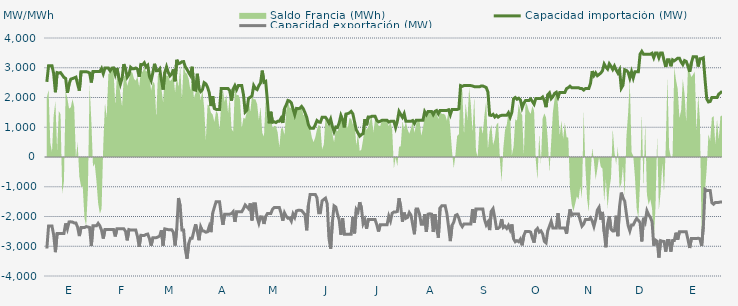
| Category | Capacidad importación (MW) | Capacidad exportación (MW) |
|---|---|---|
| 0 | 2525 | -3075 |
| 1900-01-01 | 3066.667 | -2320.833 |
| 1900-01-02 | 3066.667 | -2320.833 |
| 1900-01-03 | 3066.667 | -2320.833 |
| 1900-01-04 | 2800 | -2622.917 |
| 1900-01-05 | 2177.083 | -3197.917 |
| 1900-01-06 | 2837.5 | -2568.75 |
| 1900-01-07 | 2820.833 | -2568.75 |
| 1900-01-08 | 2837.5 | -2568.75 |
| 1900-01-09 | 2758.333 | -2568.75 |
| 1900-01-10 | 2675 | -2568.75 |
| 1900-01-11 | 2641.667 | -2233.333 |
| 1900-01-12 | 2156.25 | -2418.75 |
| 1900-01-13 | 2450 | -2181.25 |
| 1900-01-14 | 2616.667 | -2179.167 |
| 1900-01-15 | 2637.5 | -2187.5 |
| 1900-01-16 | 2658.333 | -2216.667 |
| 1900-01-17 | 2683.333 | -2216.667 |
| 1900-01-18 | 2450 | -2362.5 |
| 1900-01-19 | 2231.25 | -2658.333 |
| 1900-01-20 | 2866.667 | -2372.917 |
| 1900-01-21 | 2866.667 | -2372.917 |
| 1900-01-22 | 2866.667 | -2372.917 |
| 1900-01-23 | 2866.667 | -2339.583 |
| 1900-01-24 | 2854.167 | -2352.083 |
| 1900-01-25 | 2825 | -2368.75 |
| 1900-01-26 | 2504.167 | -2991.667 |
| 1900-01-27 | 2875 | -2314.583 |
| 1900-01-28 | 2875 | -2314.583 |
| 1900-01-29 | 2875 | -2314.583 |
| 1900-01-30 | 2875 | -2231.25 |
| 1900-01-31 | 2875 | -2314.583 |
| 1900-02-01 | 2975 | -2462.5 |
| 1900-02-02 | 2802.083 | -2741.667 |
| 1900-02-03 | 2987.5 | -2433.333 |
| 1900-02-04 | 2987.5 | -2433.333 |
| 1900-02-05 | 2987.5 | -2433.333 |
| 1900-02-06 | 2893.75 | -2433.333 |
| 1900-02-07 | 2987.5 | -2433.333 |
| 1900-02-08 | 2995.833 | -2437.5 |
| 1900-02-09 | 2781.25 | -2670.833 |
| 1900-02-10 | 2993.75 | -2412.5 |
| 1900-02-11 | 2679.167 | -2412.5 |
| 1900-02-12 | 2450 | -2412.5 |
| 1900-02-13 | 2645.833 | -2412.5 |
| 1900-02-14 | 3120.833 | -2412.5 |
| 1900-02-15 | 2958.333 | -2495.833 |
| 1900-02-16 | 2681.25 | -2802.083 |
| 1900-02-17 | 2768.75 | -2439.583 |
| 1900-02-18 | 3016.667 | -2456.25 |
| 1900-02-19 | 2966.667 | -2454.167 |
| 1900-02-20 | 2966.667 | -2452.083 |
| 1900-02-21 | 2991.667 | -2454.167 |
| 1900-02-22 | 2952.083 | -2670.833 |
| 1900-02-23 | 2697.917 | -3016.667 |
| 1900-02-24 | 3108.333 | -2631.25 |
| 1900-02-25 | 3100 | -2637.5 |
| 1900-02-26 | 3166.667 | -2637.5 |
| 1900-02-27 | 3025 | -2604.167 |
| 1900-02-28 | 3083.333 | -2589.583 |
| 1900-02-28 | 2708.333 | -2743.75 |
| 1900-03-01 | 2570.833 | -2979.167 |
| 1900-03-02 | 2833.333 | -2716.667 |
| 1900-03-03 | 3133.333 | -2716.667 |
| 1900-03-04 | 2900 | -2710.417 |
| 1900-03-05 | 2904.167 | -2689.583 |
| 1900-03-06 | 2966.667 | -2654.167 |
| 1900-03-07 | 2587.5 | -2462.5 |
| 1900-03-08 | 2266.667 | -2977.083 |
| 1900-03-09 | 2845.833 | -2416.667 |
| 1900-03-10 | 3033.333 | -2429.167 |
| 1900-03-11 | 2845.833 | -2441.667 |
| 1900-03-12 | 2725 | -2441.667 |
| 1900-03-13 | 2783.333 | -2441.667 |
| 1900-03-14 | 2943.75 | -2529.167 |
| 1900-03-15 | 2545.833 | -2975 |
| 1900-03-16 | 3266.667 | -2410.417 |
| 1900-03-17 | 3137.5 | -1379.167 |
| 1900-03-18 | 3158.333 | -1654.167 |
| 1900-03-19 | 3200 | -2454.167 |
| 1900-03-20 | 3208.333 | -2456.25 |
| 1900-03-21 | 3025 | -3112.5 |
| 1900-03-22 | 2943.75 | -3418.75 |
| 1900-03-23 | 2835.417 | -2900 |
| 1900-03-24 | 2741.667 | -2729.167 |
| 1900-03-25 | 3033.333 | -2729.167 |
| 1900-03-26 | 2262.5 | -2487.5 |
| 1900-03-27 | 2245.833 | -2262.5 |
| 1900-03-28 | 2797.917 | -2500 |
| 1900-03-29 | 2295.652 | -2797.826 |
| 1900-03-30 | 2200 | -2350 |
| 1900-03-31 | 2262.5 | -2481.25 |
| 1900-04-01 | 2500 | -2491.667 |
| 1900-04-02 | 2458.333 | -2529.167 |
| 1900-04-03 | 2341.667 | -2512.5 |
| 1900-04-04 | 2162.5 | -2331.25 |
| 1900-04-05 | 1712.5 | -2525 |
| 1900-04-06 | 2043.75 | -1885.417 |
| 1900-04-07 | 1629.167 | -1687.5 |
| 1900-04-08 | 1600 | -1500 |
| 1900-04-09 | 1600 | -1500 |
| 1900-04-10 | 1600 | -1500 |
| 1900-04-11 | 2300 | -1937.5 |
| 1900-04-12 | 2300 | -2281.25 |
| 1900-04-13 | 2300 | -1920.833 |
| 1900-04-14 | 2300 | -1920.833 |
| 1900-04-15 | 2300 | -1920.833 |
| 1900-04-16 | 2225 | -1920.833 |
| 1900-04-17 | 1896.083 | -1898.167 |
| 1900-04-18 | 2287.5 | -1837.5 |
| 1900-04-19 | 2400 | -2181.25 |
| 1900-04-20 | 2266.667 | -1837.5 |
| 1900-04-21 | 2400 | -1841.667 |
| 1900-04-22 | 2400 | -1841.667 |
| 1900-04-23 | 2400 | -1841.667 |
| 1900-04-24 | 2100 | -1737.5 |
| 1900-04-25 | 1512.5 | -1612.5 |
| 1900-04-26 | 1575 | -1675 |
| 1900-04-27 | 1975 | -1737.5 |
| 1900-04-28 | 2008.333 | -1560.417 |
| 1900-04-29 | 2056.25 | -2133.333 |
| 1900-04-30 | 2400 | -1570.833 |
| 1900-05-01 | 2300 | -1570.833 |
| 1900-05-02 | 2266.667 | -2031.25 |
| 1900-05-03 | 2400 | -2225 |
| 1900-05-04 | 2487.5 | -2010.417 |
| 1900-05-05 | 2904.167 | -2016.667 |
| 1900-05-06 | 2512.5 | -2250 |
| 1900-05-07 | 2541.667 | -2000 |
| 1900-05-08 | 1884.392 | -1900 |
| 1900-05-09 | 1133.333 | -1900 |
| 1900-05-10 | 1520.875 | -1900 |
| 1900-05-11 | 1166.667 | -1758.333 |
| 1900-05-12 | 1183.333 | -1700 |
| 1900-05-13 | 1158.333 | -1700 |
| 1900-05-14 | 1200 | -1700 |
| 1900-05-15 | 1200 | -1700 |
| 1900-05-16 | 1304.583 | -1887.5 |
| 1900-05-17 | 1145.417 | -2139.583 |
| 1900-05-18 | 1629.167 | -1875 |
| 1900-05-19 | 1750 | -1987.5 |
| 1900-05-20 | 1900 | -2058.333 |
| 1900-05-21 | 1879.167 | -2050 |
| 1900-05-22 | 1820.833 | -2156.25 |
| 1900-05-23 | 1616.667 | -1912.5 |
| 1900-05-24 | 1420.833 | -2027.083 |
| 1900-05-25 | 1633.333 | -1812.5 |
| 1900-05-26 | 1625 | -1791.667 |
| 1900-05-27 | 1637.5 | -1791.667 |
| 1900-05-28 | 1700 | -1800 |
| 1900-05-29 | 1620.833 | -1868.75 |
| 1900-05-30 | 1487.5 | -1937.5 |
| 1900-05-31 | 1337.5 | -2464.583 |
| 1900-06-01 | 1083.333 | -1610.417 |
| 1900-06-02 | 966.667 | -1258.333 |
| 1900-06-03 | 966.667 | -1258.333 |
| 1900-06-04 | 966.667 | -1258.333 |
| 1900-06-05 | 1083.333 | -1258.333 |
| 1900-06-06 | 1225 | -1375 |
| 1900-06-07 | 1175 | -1875 |
| 1900-06-08 | 1166.667 | -1875 |
| 1900-06-09 | 1333.333 | -1475 |
| 1900-06-10 | 1333.333 | -1425 |
| 1900-06-11 | 1333.333 | -1383.333 |
| 1900-06-12 | 1254.167 | -1577.083 |
| 1900-06-13 | 1133.333 | -2725 |
| 1900-06-14 | 1275 | -3081.25 |
| 1900-06-15 | 1029.167 | -2189.583 |
| 1900-06-16 | 850 | -1641.667 |
| 1900-06-17 | 1008.333 | -1683.333 |
| 1900-06-18 | 991.667 | -1916.667 |
| 1900-06-19 | 1150 | -2114.583 |
| 1900-06-20 | 1400 | -2612.5 |
| 1900-06-21 | 1262.5 | -2058.333 |
| 1900-06-22 | 995.833 | -2600 |
| 1900-06-23 | 1445.833 | -2600 |
| 1900-06-24 | 1458.333 | -2600 |
| 1900-06-25 | 1483.333 | -2600 |
| 1900-06-26 | 1533.333 | -2600 |
| 1900-06-27 | 1450 | -2012.5 |
| 1900-06-28 | 1175 | -2566.667 |
| 1900-06-29 | 912.5 | -1762.5 |
| 1900-06-30 | 806.25 | -1841.667 |
| 1900-07-01 | 700 | -1520.833 |
| 1900-07-02 | 756.25 | -1710.417 |
| 1900-07-03 | 783.333 | -2239.583 |
| 1900-07-04 | 1270.833 | -2112.5 |
| 1900-07-05 | 1066.667 | -2410.417 |
| 1900-07-06 | 1345.833 | -2104.167 |
| 1900-07-07 | 1341.667 | -2104.167 |
| 1900-07-08 | 1366.667 | -2104.167 |
| 1900-07-09 | 1366.667 | -2104.167 |
| 1900-07-10 | 1366.667 | -2104.167 |
| 1900-07-11 | 1231.25 | -2275 |
| 1900-07-12 | 1181.25 | -2504.167 |
| 1900-07-13 | 1200 | -2275 |
| 1900-07-14 | 1233.333 | -2275 |
| 1900-07-15 | 1233.333 | -2275 |
| 1900-07-16 | 1233.333 | -2275 |
| 1900-07-17 | 1233.333 | -2275 |
| 1900-07-18 | 1175 | -1987.5 |
| 1900-07-19 | 1200 | -2147.917 |
| 1900-07-20 | 1200 | -1887.5 |
| 1900-07-21 | 1200 | -1850 |
| 1900-07-22 | 987.5 | -1850 |
| 1900-07-23 | 1200 | -1831.25 |
| 1900-07-24 | 1529.167 | -1387.5 |
| 1900-07-25 | 1427.083 | -1679.167 |
| 1900-07-26 | 1331.25 | -2172.917 |
| 1900-07-27 | 1456.25 | -1868.75 |
| 1900-07-28 | 1200 | -2060.417 |
| 1900-07-29 | 1200 | -2029.167 |
| 1900-07-30 | 1200 | -1868.75 |
| 1900-07-31 | 1200 | -1958.333 |
| 1900-08-01 | 1225 | -2275 |
| 1900-08-02 | 1125 | -2595.833 |
| 1900-08-03 | 1233.333 | -1750 |
| 1900-08-04 | 1233.333 | -1750 |
| 1900-08-05 | 1233.333 | -1925 |
| 1900-08-06 | 1233.333 | -2262.5 |
| 1900-08-07 | 1233.333 | -2262.5 |
| 1900-08-08 | 1525 | -1925 |
| 1900-08-09 | 1425 | -2520.833 |
| 1900-08-10 | 1533.333 | -1920.833 |
| 1900-08-11 | 1533.333 | -1908.333 |
| 1900-08-12 | 1533.333 | -1920.833 |
| 1900-08-13 | 1425 | -2520.833 |
| 1900-08-14 | 1533.333 | -1920.833 |
| 1900-08-15 | 1562.5 | -2412.5 |
| 1900-08-16 | 1454.167 | -2710.417 |
| 1900-08-17 | 1566.667 | -1712.5 |
| 1900-08-18 | 1566.667 | -1641.667 |
| 1900-08-19 | 1566.667 | -1641.667 |
| 1900-08-20 | 1566.667 | -1641.667 |
| 1900-08-21 | 1566.667 | -1904.167 |
| 1900-08-22 | 1587.5 | -2362.5 |
| 1900-08-23 | 1418.75 | -2827.083 |
| 1900-08-24 | 1595.833 | -2297.917 |
| 1900-08-25 | 1595.833 | -2193.75 |
| 1900-08-26 | 1595.833 | -1964.583 |
| 1900-08-27 | 1595.833 | -1937.5 |
| 1900-08-28 | 1618.75 | -2058.333 |
| 1900-08-29 | 2400 | -2250 |
| 1900-08-30 | 2375 | -2341.667 |
| 1900-08-31 | 2400 | -2250 |
| 1900-09-01 | 2400 | -2250 |
| 1900-09-02 | 2400 | -2250 |
| 1900-09-03 | 2400 | -2250 |
| 1900-09-04 | 2400 | -2250 |
| 1900-09-05 | 2387.5 | -1750 |
| 1900-09-06 | 2364.583 | -2208.333 |
| 1900-09-07 | 2364.583 | -1745.833 |
| 1900-09-08 | 2360.417 | -1745.833 |
| 1900-09-09 | 2358.333 | -1745.833 |
| 1900-09-10 | 2387.5 | -1745.833 |
| 1900-09-11 | 2387.5 | -1745.833 |
| 1900-09-12 | 2362.5 | -2100 |
| 1900-09-13 | 2335.417 | -2283.333 |
| 1900-09-14 | 2181.25 | -2187.5 |
| 1900-09-15 | 1408.333 | -2456.25 |
| 1900-09-16 | 1395.833 | -1820.833 |
| 1900-09-17 | 1433.333 | -1737.5 |
| 1900-09-18 | 1345.833 | -2037.5 |
| 1900-09-19 | 1400 | -2400 |
| 1900-09-20 | 1341.667 | -2400 |
| 1900-09-21 | 1383.333 | -2345.833 |
| 1900-09-22 | 1400 | -2087.5 |
| 1900-09-23 | 1400 | -2370.833 |
| 1900-09-24 | 1400 | -2327.083 |
| 1900-09-25 | 1400 | -2400 |
| 1900-09-26 | 1487.5 | -2300 |
| 1900-09-27 | 1337.5 | -2445.833 |
| 1900-09-28 | 1500 | -2266.667 |
| 1900-09-29 | 1958.333 | -2750 |
| 1900-09-30 | 2000 | -2850 |
| 1900-10-01 | 1941.667 | -2812.5 |
| 1900-10-02 | 1975 | -2850 |
| 1900-10-03 | 1920.833 | -2762.5 |
| 1900-10-04 | 1654.167 | -2968.75 |
| 1900-10-05 | 1808.333 | -2639.583 |
| 1900-10-06 | 1900 | -2500 |
| 1900-10-07 | 1900 | -2500 |
| 1900-10-08 | 1900 | -2500 |
| 1900-10-09 | 1950 | -2525 |
| 1900-10-10 | 1866.667 | -2727.083 |
| 1900-10-11 | 1775 | -2877.083 |
| 1900-10-12 | 1966.667 | -2462.5 |
| 1900-10-13 | 1966.667 | -2400 |
| 1900-10-14 | 1966.667 | -2525 |
| 1900-10-15 | 1966.667 | -2483.333 |
| 1900-10-16 | 2016.667 | -2583.333 |
| 1900-10-17 | 1900 | -2837.5 |
| 1900-10-18 | 1675 | -2887.5 |
| 1900-10-19 | 2091.667 | -2477.083 |
| 1900-10-20 | 2154.167 | -2325 |
| 1900-10-21 | 1962.5 | -2162.5 |
| 1900-10-22 | 2029.167 | -2387.5 |
| 1900-10-23 | 2137.5 | -2387.5 |
| 1900-10-24 | 2175 | -2387.5 |
| 1900-10-25 | 2010 | -1886 |
| 1900-10-26 | 2170.833 | -2383.333 |
| 1900-10-27 | 2170.833 | -2383.333 |
| 1900-10-28 | 2170.833 | -2383.333 |
| 1900-10-29 | 2170.833 | -2383.333 |
| 1900-10-30 | 2300 | -2579.167 |
| 1900-10-31 | 2331.25 | -2131.25 |
| 1900-11-01 | 2379.167 | -1758.333 |
| 1900-11-02 | 2329.167 | -1960.417 |
| 1900-11-03 | 2329.167 | -1916.667 |
| 1900-11-04 | 2329.167 | -1916.667 |
| 1900-11-05 | 2329.167 | -1916.667 |
| 1900-11-06 | 2329.167 | -1918.75 |
| 1900-11-07 | 2300 | -2131.25 |
| 1900-11-08 | 2300 | -2325 |
| 1900-11-09 | 2250 | -2256.25 |
| 1900-11-10 | 2300 | -2104.167 |
| 1900-11-11 | 2300 | -2104.167 |
| 1900-11-12 | 2300 | -2104.167 |
| 1900-11-13 | 2475 | -2043.75 |
| 1900-11-14 | 2887.5 | -2150 |
| 1900-11-15 | 2737.5 | -2335.417 |
| 1900-11-16 | 2829.167 | -2106.25 |
| 1900-11-17 | 2732.25 | -1787 |
| 1900-11-18 | 2775 | -1691.667 |
| 1900-11-19 | 2820.833 | -2106.25 |
| 1900-11-20 | 2900 | -1845.833 |
| 1900-11-21 | 3125 | -2520.833 |
| 1900-11-22 | 3025 | -3033.333 |
| 1900-11-23 | 2956.25 | -2250 |
| 1900-11-24 | 3133.333 | -1987.5 |
| 1900-11-25 | 3045.833 | -2425 |
| 1900-11-26 | 2941.667 | -2485.417 |
| 1900-11-27 | 3058.333 | -2483.333 |
| 1900-11-28 | 2925 | -1975 |
| 1900-11-29 | 2825 | -2662.5 |
| 1900-11-30 | 2933.333 | -1658.333 |
| 1900-12-01 | 2312.5 | -1195.833 |
| 1900-12-02 | 2412.5 | -1375 |
| 1900-12-03 | 2933.333 | -1483.333 |
| 1900-12-04 | 2910.417 | -1912.5 |
| 1900-12-05 | 2850 | -2300 |
| 1900-12-06 | 2650 | -2483.333 |
| 1900-12-07 | 2866.667 | -2283.333 |
| 1900-12-08 | 2658.333 | -2283.333 |
| 1900-12-09 | 2866.667 | -2162.5 |
| 1900-12-10 | 2866.667 | -2066.667 |
| 1900-12-11 | 2866.667 | -2129.167 |
| 1900-12-12 | 3456.25 | -2204.167 |
| 1900-12-13 | 3550 | -2837.5 |
| 1900-12-14 | 3454.167 | -2041.667 |
| 1900-12-15 | 3454.167 | -2179.167 |
| 1900-12-16 | 3454.167 | -1808.333 |
| 1900-12-17 | 3454.167 | -1938.75 |
| 1900-12-18 | 3454.167 | -2029.167 |
| 1900-12-19 | 3487.5 | -2175 |
| 1900-12-20 | 3337.5 | -2983.333 |
| 1900-12-21 | 3500 | -2791.667 |
| 1900-12-22 | 3500 | -2833.333 |
| 1900-12-23 | 3337.5 | -3379.167 |
| 1900-12-24 | 3500 | -2812.5 |
| 1900-12-25 | 3500 | -2833.333 |
| 1900-12-26 | 3250 | -2837.5 |
| 1900-12-27 | 3028.25 | -3181.25 |
| 1900-12-28 | 3266.667 | -2808.333 |
| 1900-12-29 | 3266.667 | -2808.333 |
| 1900-12-30 | 3050 | -3181.25 |
| 1900-12-31 | 3266.667 | -2808.333 |
| 1901-01-01 | 3233.333 | -2808.333 |
| 1901-01-02 | 3275 | -2543.75 |
| 1901-01-03 | 3320.833 | -2779.167 |
| 1901-01-04 | 3320.833 | -2516.667 |
| 1901-01-05 | 3195.833 | -2516.667 |
| 1901-01-06 | 3108.333 | -2516.667 |
| 1901-01-07 | 3241.667 | -2516.667 |
| 1901-01-08 | 3212.5 | -2516.667 |
| 1901-01-09 | 3054.167 | -2775 |
| 1901-01-10 | 2862.5 | -3058.333 |
| 1901-01-11 | 3162.5 | -2741.667 |
| 1901-01-12 | 3366.667 | -2741.667 |
| 1901-01-13 | 3366.667 | -2741.667 |
| 1901-01-14 | 3366.667 | -2741.667 |
| 1901-01-15 | 3041.667 | -2729.167 |
| 1901-01-16 | 3306.25 | -2750 |
| 1901-01-17 | 3306.25 | -2991.667 |
| 1901-01-18 | 3333.333 | -2337.5 |
| 1901-01-19 | 2602.083 | -1083.333 |
| 1901-01-20 | 1950 | -1125 |
| 1901-01-21 | 1850 | -1125 |
| 1901-01-22 | 1866.667 | -1125 |
| 1901-01-23 | 2000 | -1537.5 |
| 1901-01-24 | 2000 | -1587.5 |
| 1901-01-25 | 2000 | -1529.167 |
| 1901-01-26 | 2000 | -1529.167 |
| 1901-01-27 | 2114.583 | -1525 |
| 1901-01-28 | 2154.167 | -1512.5 |
| 1901-01-29 | 2210.417 | -1516.667 |